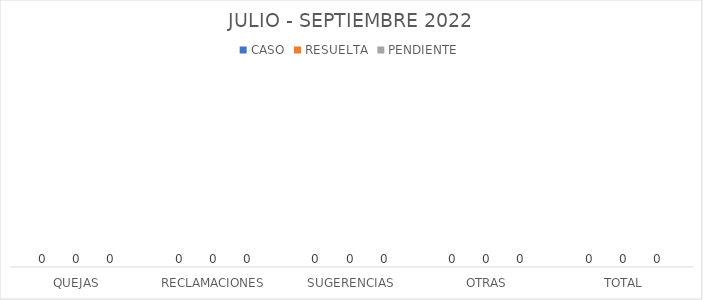
| Category | CASO | RESUELTA | PENDIENTE |
|---|---|---|---|
| QUEJAS | 0 | 0 | 0 |
| RECLAMACIONES | 0 | 0 | 0 |
| SUGERENCIAS | 0 | 0 | 0 |
| OTRAS | 0 | 0 | 0 |
| TOTAL | 0 | 0 | 0 |